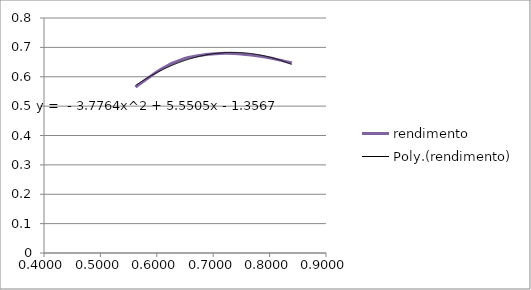
| Category | rendimento |
|---|---|
| 0.5622758429499359 | 0.565 |
| 0.6088321882942158 | 0.627 |
| 0.6496891115053053 | 0.662 |
| 0.6867857188114843 | 0.675 |
| 0.7211650077989293 | 0.68 |
| 0.7532797811070147 | 0.677 |
| 0.7836529639583591 | 0.669 |
| 0.812345449437261 | 0.659 |
| 0.8395716080679595 | 0.647 |